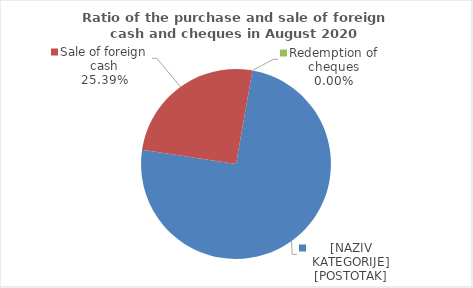
| Category | Series 0 |
|---|---|
| Purchase of foreign cash | 74.609 |
| Sale of foreign cash | 25.391 |
| Redemption of cheques | 0 |